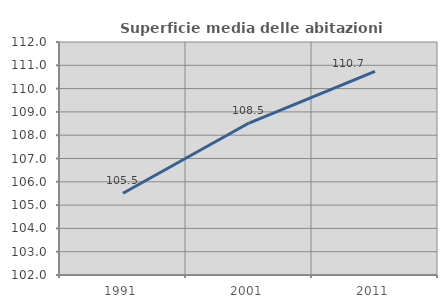
| Category | Superficie media delle abitazioni occupate |
|---|---|
| 1991.0 | 105.507 |
| 2001.0 | 108.523 |
| 2011.0 | 110.737 |